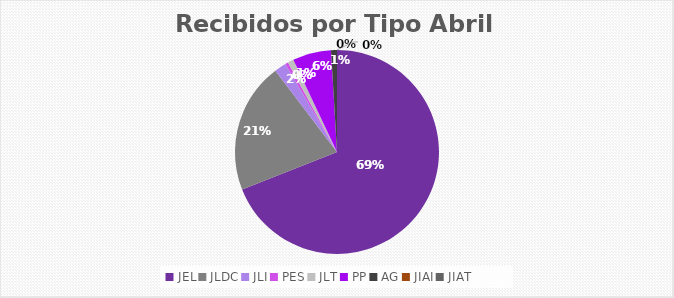
| Category | Series 0 |
|---|---|
| JEL | 147 |
| JLDC | 44 |
| JLI | 4 |
| PES | 1 |
| JLT | 2 |
| PP | 13 |
| AG | 2 |
| JIAI | 0 |
| JIAT | 0 |